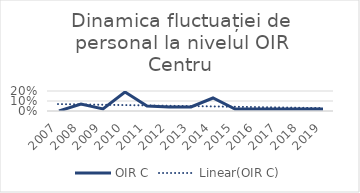
| Category | OIR C |
|---|---|
| 2007.0 | 0 |
| 2008.0 | 0.07 |
| 2009.0 | 0.02 |
| 2010.0 | 0.19 |
| 2011.0 | 0.05 |
| 2012.0 | 0.04 |
| 2013.0 | 0.04 |
| 2014.0 | 0.13 |
| 2015.0 | 0.02 |
| 2016.0 | 0.02 |
| 2017.0 | 0.02 |
| 2018.0 | 0.02 |
| 2019.0 | 0.02 |